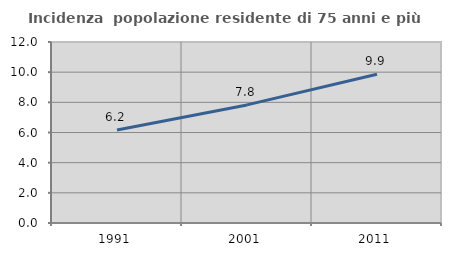
| Category | Incidenza  popolazione residente di 75 anni e più |
|---|---|
| 1991.0 | 6.164 |
| 2001.0 | 7.829 |
| 2011.0 | 9.86 |